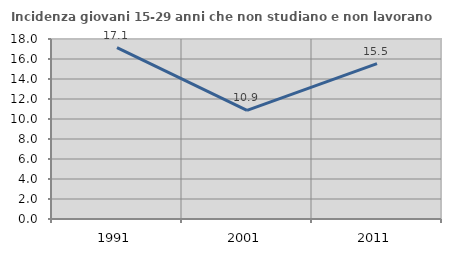
| Category | Incidenza giovani 15-29 anni che non studiano e non lavorano  |
|---|---|
| 1991.0 | 17.136 |
| 2001.0 | 10.865 |
| 2011.0 | 15.532 |